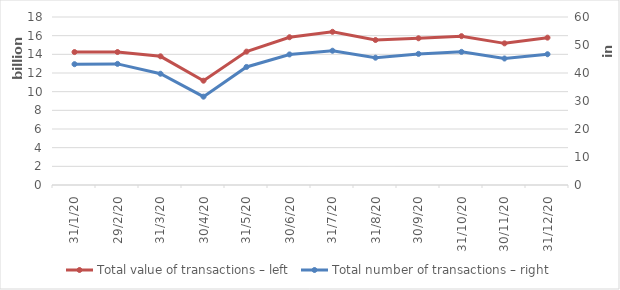
| Category | Total value of transactions – left |
|---|---|
| 31/1/20 | 14243130221.338 |
| 29/2/20 | 14247295640.211 |
| 31/3/20 | 13786598479.435 |
| 30/4/20 | 11175390464.643 |
| 31/5/20 | 14290906717.006 |
| 30/6/20 | 15830535434.621 |
| 31/7/20 | 16413909000.575 |
| 31/8/20 | 15535565298.73 |
| 30/9/20 | 15719943818.504 |
| 31/10/20 | 15947042511.608 |
| 30/11/20 | 15176083449.602 |
| 31/12/20 | 15787754854.753 |